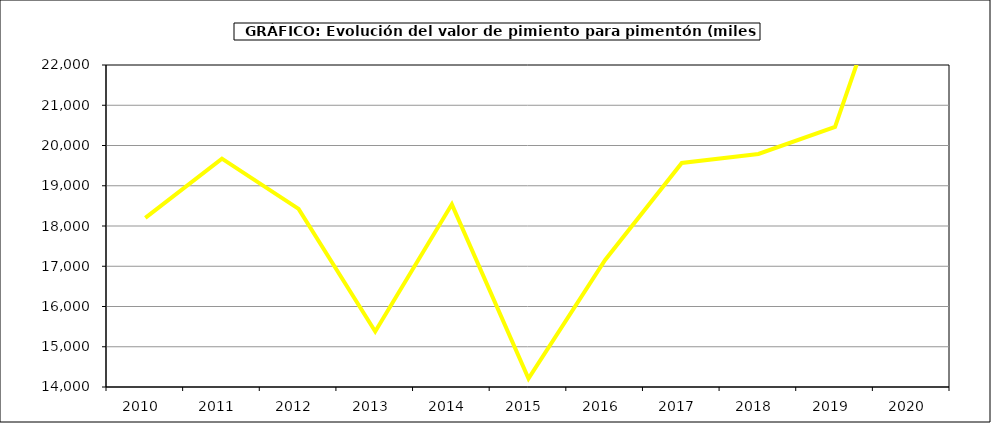
| Category | Valor |
|---|---|
| 2010.0 | 18201.072 |
| 2011.0 | 19672.3 |
| 2012.0 | 18426.65 |
| 2013.0 | 15378.158 |
| 2014.0 | 18538.464 |
| 2015.0 | 14208 |
| 2016.0 | 17155 |
| 2017.0 | 19566.151 |
| 2018.0 | 19789.623 |
| 2019.0 | 20460.673 |
| 2020.0 | 25973.226 |